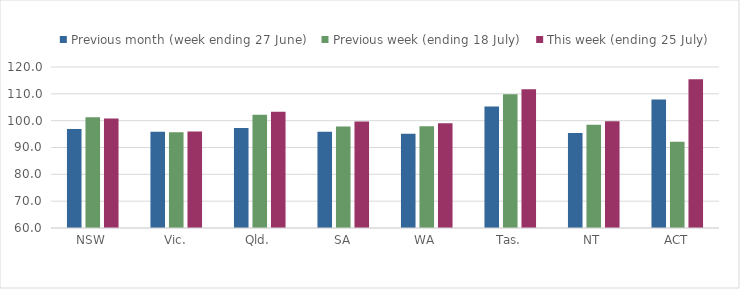
| Category | Previous month (week ending 27 June) | Previous week (ending 18 July) | This week (ending 25 July) |
|---|---|---|---|
| NSW | 96.899 | 101.257 | 100.775 |
| Vic. | 95.905 | 95.675 | 96 |
| Qld. | 97.294 | 102.167 | 103.278 |
| SA | 95.899 | 97.865 | 99.651 |
| WA | 95.078 | 97.9 | 99.035 |
| Tas. | 105.263 | 109.825 | 111.663 |
| NT | 95.445 | 98.482 | 99.787 |
| ACT | 107.895 | 92.105 | 115.421 |